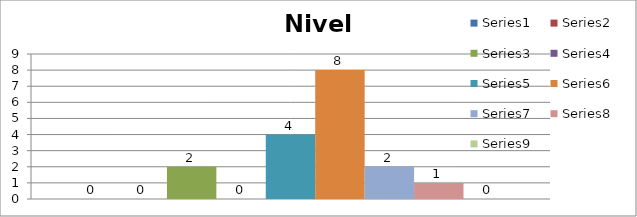
| Category | Series 0 | Series 1 | Series 2 | Series 3 | Series 4 | Series 5 | Series 6 | Series 7 | Series 8 |
|---|---|---|---|---|---|---|---|---|---|
| 0 | 0 | 0 | 2 | 0 | 4 | 8 | 2 | 1 | 0 |